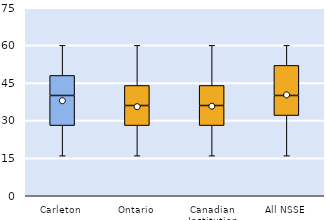
| Category | 25th | 50th | 75th |
|---|---|---|---|
| Carleton | 28 | 12 | 8 |
| Ontario | 28 | 8 | 8 |
| Canadian Institution | 28 | 8 | 8 |
| All NSSE | 32 | 8 | 12 |